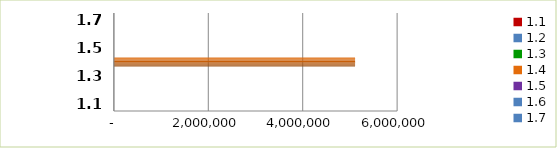
| Category | Series 0 |
|---|---|
| 1.1 | 0 |
| 1.2 | 0 |
| 1.3 | 0 |
| 1.4 | 5110277 |
| 1.5 | 0 |
| 1.6 | 0 |
| 1.7 | 0 |